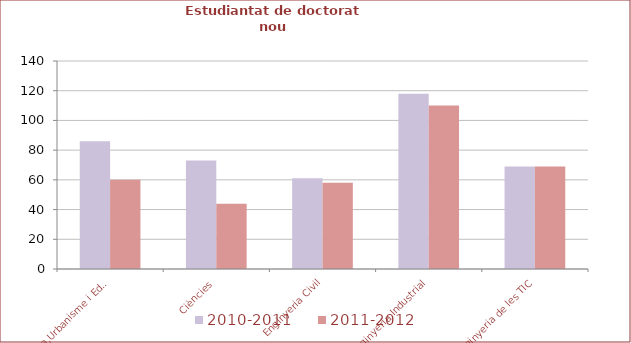
| Category | 2010-2011 | 2011-2012 |
|---|---|---|
| Arquitectura,Urbanisme i Edificació | 86 | 60 |
| Ciències | 73 | 44 |
| Enginyeria Civil | 61 | 58 |
| Enginyeria Industrial | 118 | 110 |
| Enginyeria de les TIC | 69 | 69 |